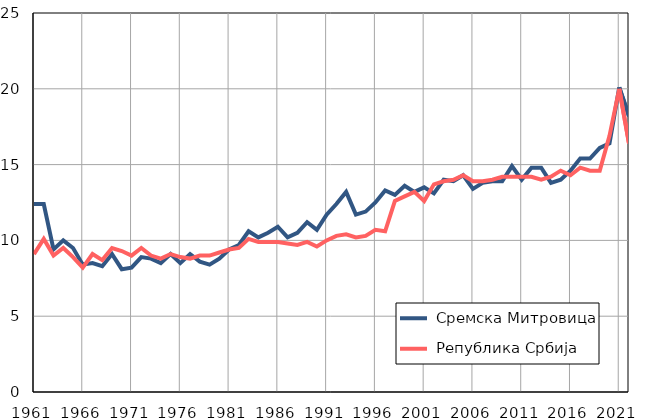
| Category |  Сремска Митровица |  Република Србија |
|---|---|---|
| 1961.0 | 12.4 | 9.1 |
| 1962.0 | 12.4 | 10.1 |
| 1963.0 | 9.4 | 9 |
| 1964.0 | 10 | 9.5 |
| 1965.0 | 9.5 | 8.9 |
| 1966.0 | 8.4 | 8.2 |
| 1967.0 | 8.5 | 9.1 |
| 1968.0 | 8.3 | 8.7 |
| 1969.0 | 9.1 | 9.5 |
| 1970.0 | 8.1 | 9.3 |
| 1971.0 | 8.2 | 9 |
| 1972.0 | 8.9 | 9.5 |
| 1973.0 | 8.8 | 9 |
| 1974.0 | 8.5 | 8.8 |
| 1975.0 | 9.1 | 9.1 |
| 1976.0 | 8.5 | 8.9 |
| 1977.0 | 9.1 | 8.8 |
| 1978.0 | 8.6 | 9 |
| 1979.0 | 8.4 | 9 |
| 1980.0 | 8.8 | 9.2 |
| 1981.0 | 9.4 | 9.4 |
| 1982.0 | 9.7 | 9.5 |
| 1983.0 | 10.6 | 10.1 |
| 1984.0 | 10.2 | 9.9 |
| 1985.0 | 10.5 | 9.9 |
| 1986.0 | 10.9 | 9.9 |
| 1987.0 | 10.2 | 9.8 |
| 1988.0 | 10.5 | 9.7 |
| 1989.0 | 11.2 | 9.9 |
| 1990.0 | 10.7 | 9.6 |
| 1991.0 | 11.7 | 10 |
| 1992.0 | 12.4 | 10.3 |
| 1993.0 | 13.2 | 10.4 |
| 1994.0 | 11.7 | 10.2 |
| 1995.0 | 11.9 | 10.3 |
| 1996.0 | 12.5 | 10.7 |
| 1997.0 | 13.3 | 10.6 |
| 1998.0 | 13 | 12.6 |
| 1999.0 | 13.6 | 12.9 |
| 2000.0 | 13.2 | 13.2 |
| 2001.0 | 13.5 | 12.6 |
| 2002.0 | 13.1 | 13.7 |
| 2003.0 | 14 | 13.9 |
| 2004.0 | 13.9 | 14 |
| 2005.0 | 14.3 | 14.3 |
| 2006.0 | 13.4 | 13.9 |
| 2007.0 | 13.8 | 13.9 |
| 2008.0 | 13.9 | 14 |
| 2009.0 | 13.9 | 14.2 |
| 2010.0 | 14.9 | 14.2 |
| 2011.0 | 14 | 14.2 |
| 2012.0 | 14.8 | 14.2 |
| 2013.0 | 14.8 | 14 |
| 2014.0 | 13.8 | 14.2 |
| 2015.0 | 14 | 14.6 |
| 2016.0 | 14.6 | 14.3 |
| 2017.0 | 15.4 | 14.8 |
| 2018.0 | 15.4 | 14.6 |
| 2019.0 | 16.1 | 14.6 |
| 2020.0 | 16.4 | 16.9 |
| 2021.0 | 20.1 | 20 |
| 2022.0 | 18.2 | 16.4 |